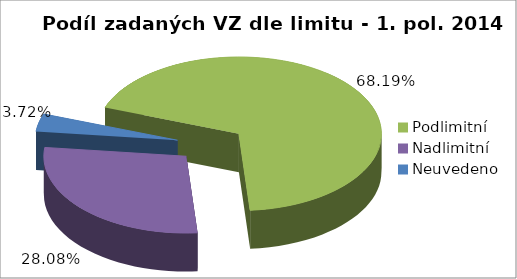
| Category | Series 0 |
|---|---|
| Podlimitní | 4395 |
| Nadlimitní | 1810 |
| Neuvedeno | 240 |